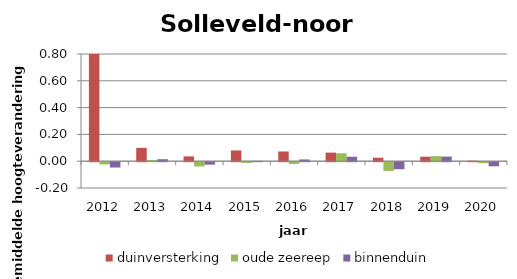
| Category | duinversterking | oude zeereep | binnenduin |
|---|---|---|---|
| 2012.0 | 0.822 | -0.017 | -0.04 |
| 2013.0 | 0.099 | 0.008 | 0.015 |
| 2014.0 | 0.036 | -0.032 | -0.018 |
| 2015.0 | 0.08 | -0.006 | 0.003 |
| 2016.0 | 0.073 | -0.013 | 0.013 |
| 2017.0 | 0.064 | 0.06 | 0.033 |
| 2018.0 | 0.026 | -0.065 | -0.052 |
| 2019.0 | 0.034 | 0.038 | 0.034 |
| 2020.0 | 0.004 | -0.008 | -0.031 |